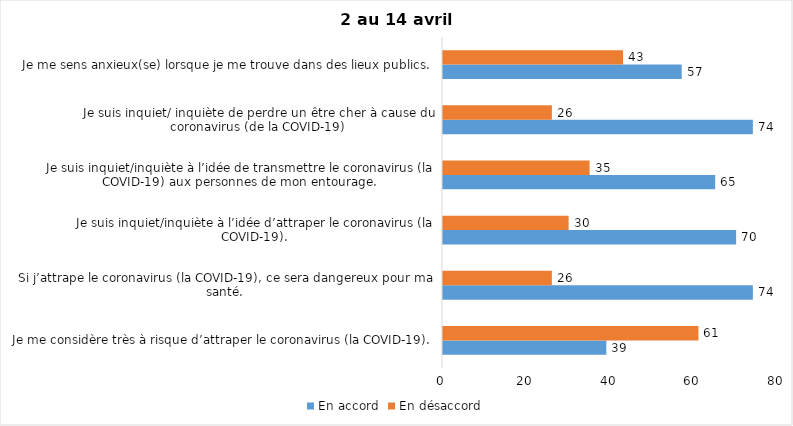
| Category | En accord | En désaccord |
|---|---|---|
| Je me considère très à risque d’attraper le coronavirus (la COVID-19). | 39 | 61 |
| Si j’attrape le coronavirus (la COVID-19), ce sera dangereux pour ma santé. | 74 | 26 |
| Je suis inquiet/inquiète à l’idée d’attraper le coronavirus (la COVID-19). | 70 | 30 |
| Je suis inquiet/inquiète à l’idée de transmettre le coronavirus (la COVID-19) aux personnes de mon entourage. | 65 | 35 |
| Je suis inquiet/ inquiète de perdre un être cher à cause du coronavirus (de la COVID-19) | 74 | 26 |
| Je me sens anxieux(se) lorsque je me trouve dans des lieux publics. | 57 | 43 |